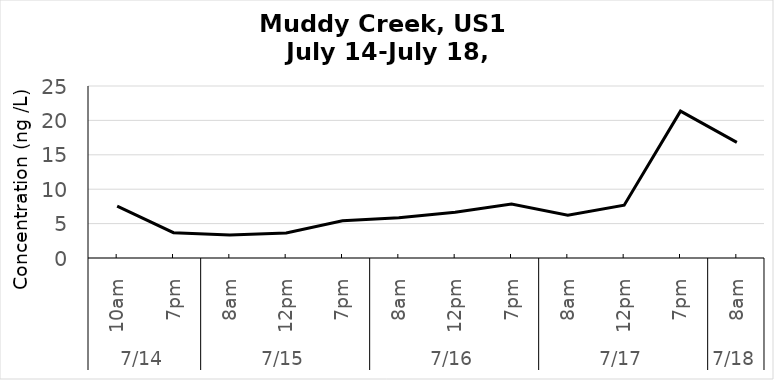
| Category | Metformin (ng/L) |
|---|---|
| 0 | 7.552 |
| 1/1/00 | 3.685 |
| 1/2/00 | 3.339 |
| 1/3/00 | 3.634 |
| 1/4/00 | 5.416 |
| 1/5/00 | 5.837 |
| 1/6/00 | 6.654 |
| 1/7/00 | 7.829 |
| 1/8/00 | 6.211 |
| 1/9/00 | 7.679 |
| 1/10/00 | 21.347 |
| 1/11/00 | 16.81 |